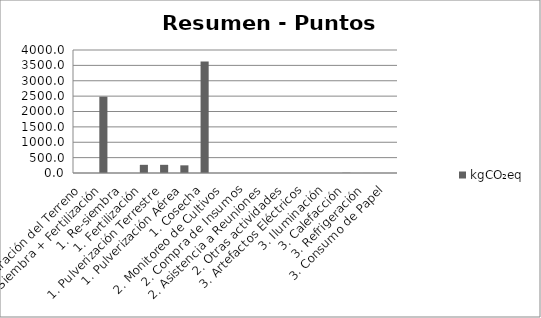
| Category | kgCO₂eq |
|---|---|
| 1. Preparación del Terreno | 0 |
| 1. Siembra + Fertilización | 2482 |
| 1. Re-siembra | 0 |
| 1. Fertilización | 265.92 |
| 1. Pulverización Terrestre | 265.92 |
| 1. Pulverización Aérea | 249.3 |
| 1. Cosecha | 3628.7 |
| 2. Monitoreo de Cultivos | 0 |
| 2. Compra de Insumos | 0 |
| 2. Asistencia a Reuniones | 0 |
| 2. Otras actividades | 0 |
| 3. Artefactos Eléctricos | 0 |
| 3. Iluminación | 0 |
| 3. Calefacción | 7.897 |
| 3. Refrigeración | 1.312 |
| 3. Consumo de Papel | 0 |